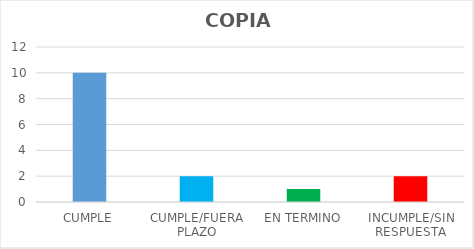
| Category | TOTAL |
|---|---|
| CUMPLE | 10 |
| CUMPLE/FUERA PLAZO | 2 |
| EN TERMINO | 1 |
| INCUMPLE/SIN RESPUESTA | 2 |